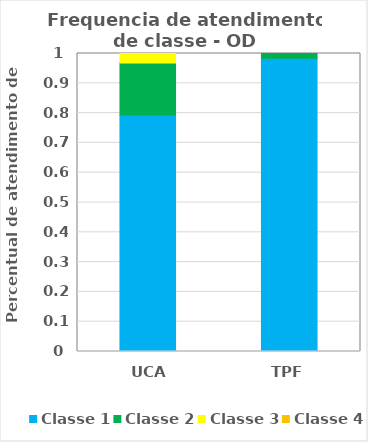
| Category | Classe 1 | Classe 2 | Classe 3 | Classe 4 |
|---|---|---|---|---|
| UCA | 0.794 | 0.175 | 0.032 | 0 |
| TPF | 0.984 | 0.016 | 0 | 0 |